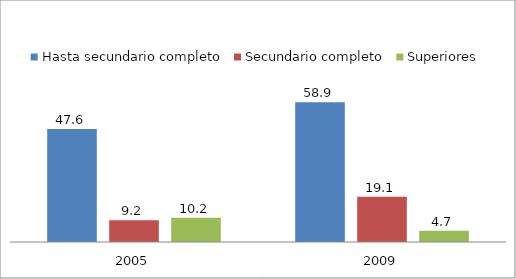
| Category | Hasta secundario completo | Secundario completo | Superiores |
|---|---|---|---|
| 2005 | 47.6 | 9.2 | 10.2 |
| 2009 | 58.9 | 19.1 | 4.7 |